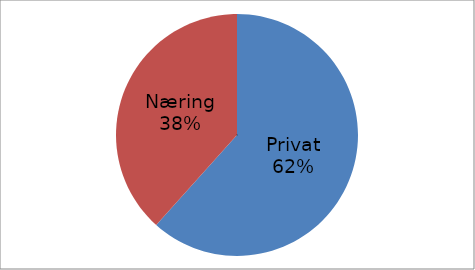
| Category | Series 0 |
|---|---|
| Privat | 32766628 |
| Næring | 20394736 |